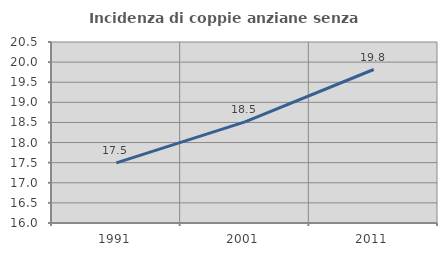
| Category | Incidenza di coppie anziane senza figli  |
|---|---|
| 1991.0 | 17.494 |
| 2001.0 | 18.515 |
| 2011.0 | 19.816 |